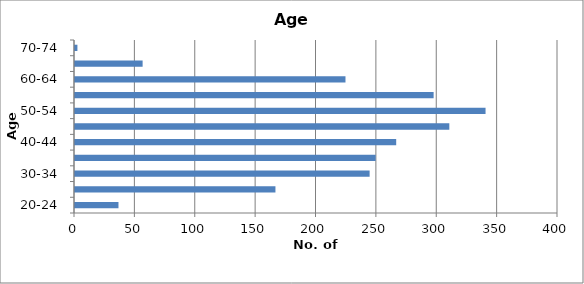
| Category | Number of people |
|---|---|
| 20-24 | 36 |
| 25-29 | 166 |
| 30-34 | 244 |
| 35-39 | 249 |
| 40-44 | 266 |
| 45-49 | 310 |
| 50-54 | 340 |
| 55-59 | 297 |
| 60-64 | 224 |
| 65-69 | 56 |
| 70-74 | 2 |